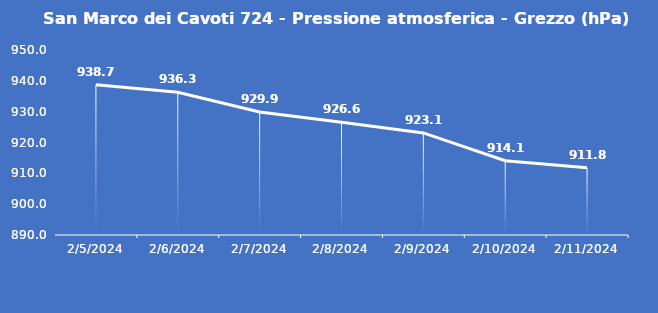
| Category | San Marco dei Cavoti 724 - Pressione atmosferica - Grezzo (hPa) |
|---|---|
| 2/5/24 | 938.7 |
| 2/6/24 | 936.3 |
| 2/7/24 | 929.9 |
| 2/8/24 | 926.6 |
| 2/9/24 | 923.1 |
| 2/10/24 | 914.1 |
| 2/11/24 | 911.8 |